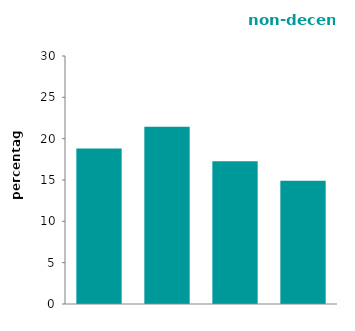
| Category | non-decent |
|---|---|
| house | 18.823 |
| three 
or less | 21.439 |
| four to 
five  | 17.258 |
| high rise | 14.908 |